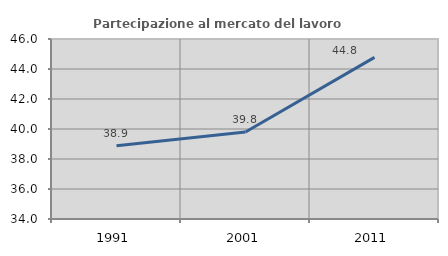
| Category | Partecipazione al mercato del lavoro  femminile |
|---|---|
| 1991.0 | 38.889 |
| 2001.0 | 39.801 |
| 2011.0 | 44.776 |